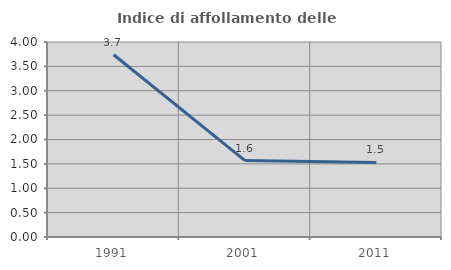
| Category | Indice di affollamento delle abitazioni  |
|---|---|
| 1991.0 | 3.739 |
| 2001.0 | 1.567 |
| 2011.0 | 1.529 |